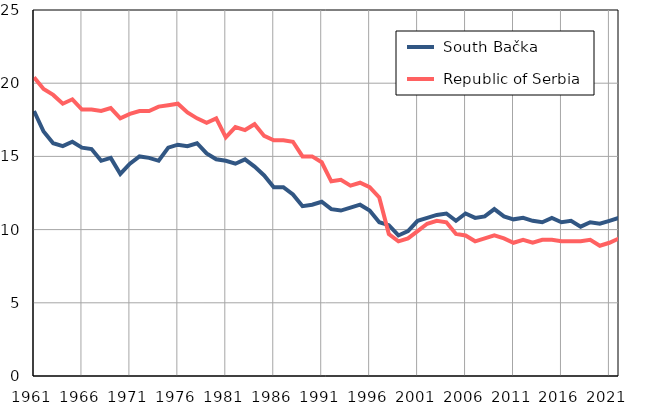
| Category |  South Bačka |  Republic of Serbia |
|---|---|---|
| 1961.0 | 18.1 | 20.4 |
| 1962.0 | 16.7 | 19.6 |
| 1963.0 | 15.9 | 19.2 |
| 1964.0 | 15.7 | 18.6 |
| 1965.0 | 16 | 18.9 |
| 1966.0 | 15.6 | 18.2 |
| 1967.0 | 15.5 | 18.2 |
| 1968.0 | 14.7 | 18.1 |
| 1969.0 | 14.9 | 18.3 |
| 1970.0 | 13.8 | 17.6 |
| 1971.0 | 14.5 | 17.9 |
| 1972.0 | 15 | 18.1 |
| 1973.0 | 14.9 | 18.1 |
| 1974.0 | 14.7 | 18.4 |
| 1975.0 | 15.6 | 18.5 |
| 1976.0 | 15.8 | 18.6 |
| 1977.0 | 15.7 | 18 |
| 1978.0 | 15.9 | 17.6 |
| 1979.0 | 15.2 | 17.3 |
| 1980.0 | 14.8 | 17.6 |
| 1981.0 | 14.7 | 16.3 |
| 1982.0 | 14.5 | 17 |
| 1983.0 | 14.8 | 16.8 |
| 1984.0 | 14.3 | 17.2 |
| 1985.0 | 13.7 | 16.4 |
| 1986.0 | 12.9 | 16.1 |
| 1987.0 | 12.9 | 16.1 |
| 1988.0 | 12.4 | 16 |
| 1989.0 | 11.6 | 15 |
| 1990.0 | 11.7 | 15 |
| 1991.0 | 11.9 | 14.6 |
| 1992.0 | 11.4 | 13.3 |
| 1993.0 | 11.3 | 13.4 |
| 1994.0 | 11.5 | 13 |
| 1995.0 | 11.7 | 13.2 |
| 1996.0 | 11.3 | 12.9 |
| 1997.0 | 10.5 | 12.2 |
| 1998.0 | 10.3 | 9.7 |
| 1999.0 | 9.6 | 9.2 |
| 2000.0 | 9.9 | 9.4 |
| 2001.0 | 10.6 | 9.9 |
| 2002.0 | 10.8 | 10.4 |
| 2003.0 | 11 | 10.6 |
| 2004.0 | 11.1 | 10.5 |
| 2005.0 | 10.6 | 9.7 |
| 2006.0 | 11.1 | 9.6 |
| 2007.0 | 10.8 | 9.2 |
| 2008.0 | 10.9 | 9.4 |
| 2009.0 | 11.4 | 9.6 |
| 2010.0 | 10.9 | 9.4 |
| 2011.0 | 10.7 | 9.1 |
| 2012.0 | 10.8 | 9.3 |
| 2013.0 | 10.6 | 9.1 |
| 2014.0 | 10.5 | 9.3 |
| 2015.0 | 10.8 | 9.3 |
| 2016.0 | 10.5 | 9.2 |
| 2017.0 | 10.6 | 9.2 |
| 2018.0 | 10.2 | 9.2 |
| 2019.0 | 10.5 | 9.3 |
| 2020.0 | 10.4 | 8.9 |
| 2021.0 | 10.6 | 9.1 |
| 2022.0 | 10.8 | 9.4 |